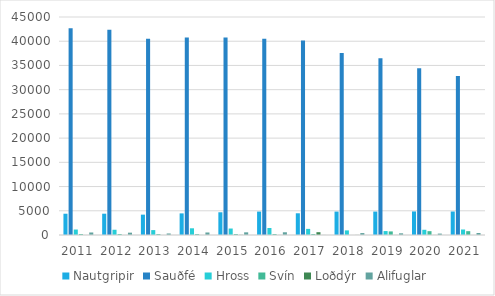
| Category | Nautgripir | Sauðfé | Hross | Svín | Loðdýr | Alifuglar |
|---|---|---|---|---|---|---|
| 2011.0 | 4392 | 42675 | 1130 | 196 | 0 | 521 |
| 2012.0 | 4397 | 42390 | 1084 | 195 | 0 | 483 |
| 2013.0 | 4201 | 40487 | 1014 | 189 | 0 | 314 |
| 2014.0 | 4462 | 40771 | 1385 | 185 | 0 | 519 |
| 2015.0 | 4690 | 40756 | 1338 | 196 | 29 | 551 |
| 2016.0 | 4834 | 40490 | 1448 | 196 | 15 | 564 |
| 2017.0 | 4483 | 40159 | 1265 | 196 | 579 | 14 |
| 2018.0 | 4833 | 37589 | 951 | 0 | 17 | 397 |
| 2019.0 | 4834 | 36491 | 812 | 740 | 10 | 348 |
| 2020.0 | 4861 | 34422 | 1077 | 793 | 13 | 291 |
| 2021.0 | 4848 | 32832 | 1134 | 793 | 5 | 408 |